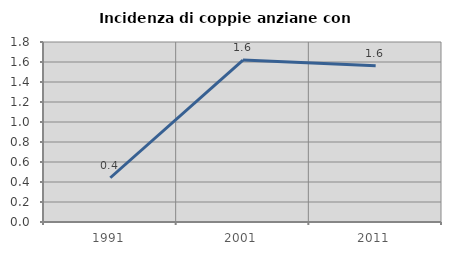
| Category | Incidenza di coppie anziane con figli |
|---|---|
| 1991.0 | 0.442 |
| 2001.0 | 1.619 |
| 2011.0 | 1.562 |